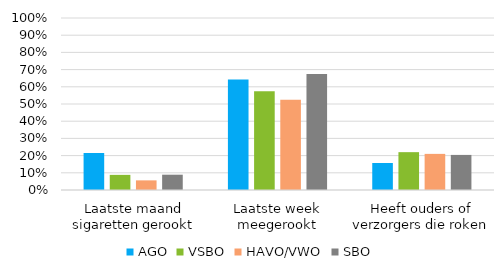
| Category | AGO | VSBO | HAVO/VWO | SBO |
|---|---|---|---|---|
| Laatste maand sigaretten gerookt | 0.215 | 0.088 | 0.056 | 0.089 |
| Laatste week meegerookt | 0.643 | 0.574 | 0.524 | 0.675 |
| Heeft ouders of verzorgers die roken | 0.157 | 0.22 | 0.21 | 0.204 |